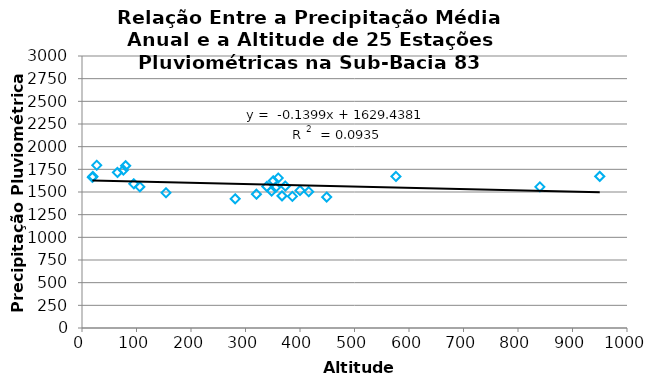
| Category | Series 0 |
|---|---|
| 351.0 | 1622.969 |
| 339.0 | 1561.639 |
| 449.0 | 1443.835 |
| 373.0 | 1564.9 |
| 400.0 | 1516.453 |
| 355.0 | 1550.047 |
| 65.0 | 1715.533 |
| 281.0 | 1425.153 |
| 95.0 | 1589.89 |
| 19.0 | 1662.124 |
| 576.0 | 1671.796 |
| 320.0 | 1475.456 |
| 840.0 | 1556.593 |
| 950.0 | 1672.045 |
| 360.0 | 1654.113 |
| 27.0 | 1794.61 |
| 80.0 | 1789.47 |
| 76.0 | 1741.437 |
| 20.0 | 1671.137 |
| 367.0 | 1457.277 |
| 386.0 | 1451.374 |
| 348.0 | 1510.577 |
| 106.0 | 1557.103 |
| 416.0 | 1503.947 |
| 154.0 | 1491.702 |